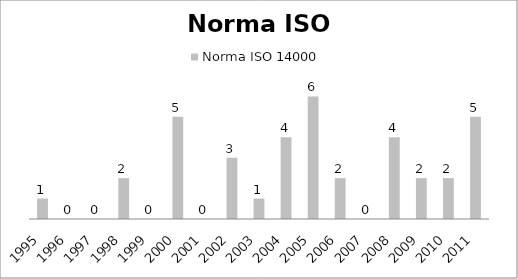
| Category | Norma ISO 14000 |
|---|---|
| 1995.0 | 1 |
| 1996.0 | 0 |
| 1997.0 | 0 |
| 1998.0 | 2 |
| 1999.0 | 0 |
| 2000.0 | 5 |
| 2001.0 | 0 |
| 2002.0 | 3 |
| 2003.0 | 1 |
| 2004.0 | 4 |
| 2005.0 | 6 |
| 2006.0 | 2 |
| 2007.0 | 0 |
| 2008.0 | 4 |
| 2009.0 | 2 |
| 2010.0 | 2 |
| 2011.0 | 5 |